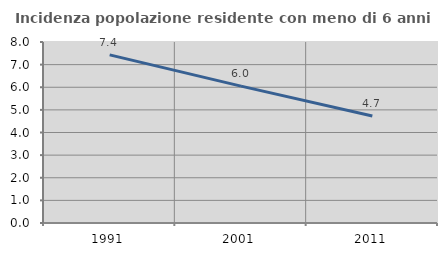
| Category | Incidenza popolazione residente con meno di 6 anni |
|---|---|
| 1991.0 | 7.432 |
| 2001.0 | 6.049 |
| 2011.0 | 4.728 |